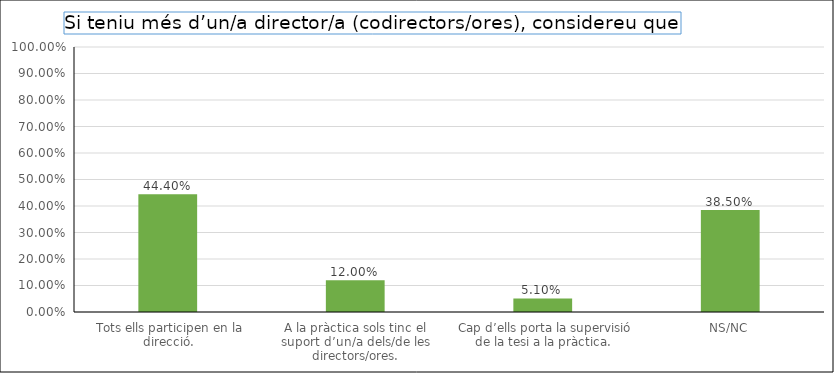
| Category | Series 0 |
|---|---|
|  Tots ells participen en la direcció. | 0.444 |
| A la pràctica sols tinc el suport d’un/a dels/de les directors/ores. | 0.12 |
|  Cap d’ells porta la supervisió de la tesi a la pràctica. | 0.051 |
| NS/NC | 0.385 |